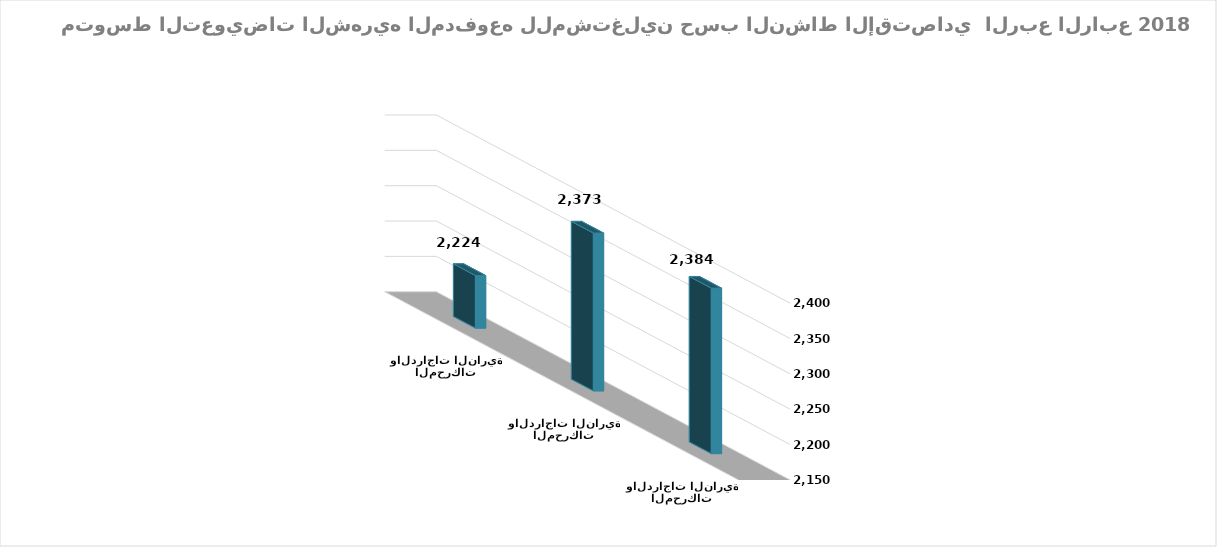
| Category | متوسط التعويضات  |
|---|---|
| بيع وإصلاح المركبات ذات المحركات والدراجات النارية | 2384.026 |
| تجارة الجملة، باستثناء المركبات ذات المحركات والدراجات النارية | 2373.197 |
| تجارة التجزئة، باستثناء المركبات ذات المحركات والدراجات النارية | 2224.359 |